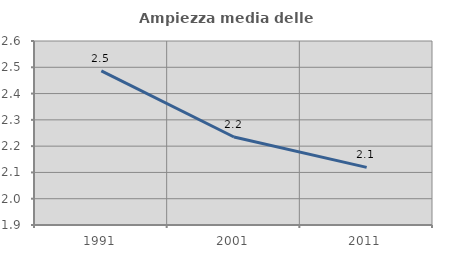
| Category | Ampiezza media delle famiglie |
|---|---|
| 1991.0 | 2.486 |
| 2001.0 | 2.235 |
| 2011.0 | 2.119 |